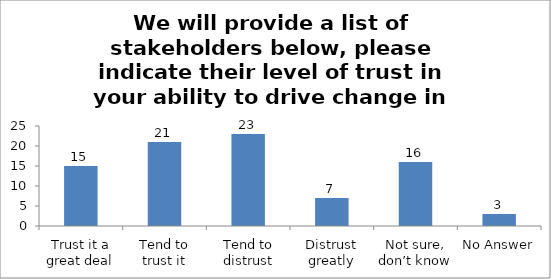
| Category | We will provide a list of stakeholders below, please indicate their level of trust in your ability to drive change in society during studies. (Government ) |
|---|---|
| Trust it a great deal | 15 |
| Tend to trust it | 21 |
| Tend to distrust | 23 |
| Distrust greatly | 7 |
| Not sure, don’t know | 16 |
| No Answer | 3 |